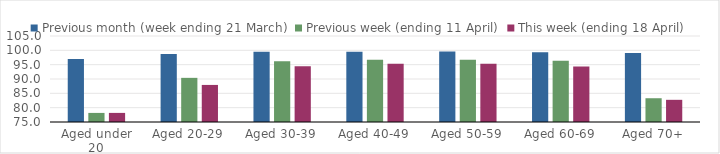
| Category | Previous month (week ending 21 March) | Previous week (ending 11 April) | This week (ending 18 April) |
|---|---|---|---|
| Aged under 20 | 96.946 | 78.169 | 78.173 |
| Aged 20-29 | 98.725 | 90.4 | 87.931 |
| Aged 30-39 | 99.524 | 96.187 | 94.441 |
| Aged 40-49 | 99.549 | 96.699 | 95.289 |
| Aged 50-59 | 99.551 | 96.744 | 95.325 |
| Aged 60-69 | 99.33 | 96.328 | 94.384 |
| Aged 70+ | 99.087 | 83.291 | 82.737 |